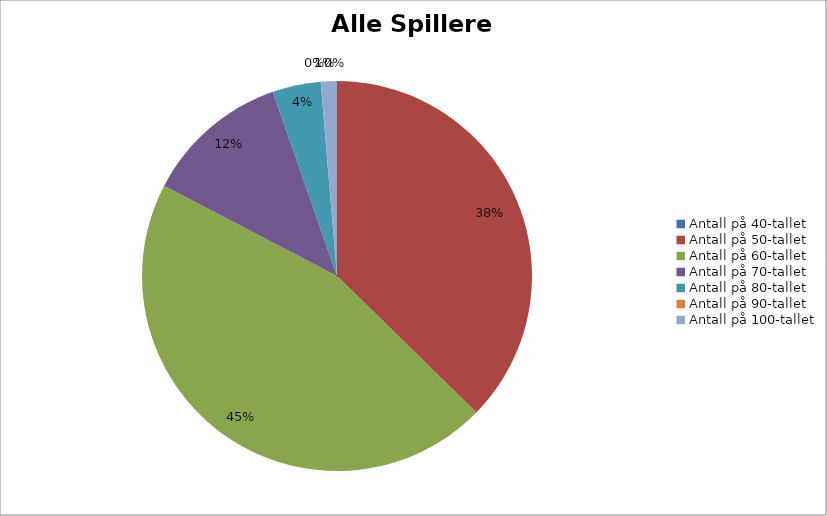
| Category | Alle Spillere totalt |
|---|---|
| Antall på 40-tallet | 0 |
| Antall på 50-tallet | 28 |
| Antall på 60-tallet | 34 |
| Antall på 70-tallet | 9 |
| Antall på 80-tallet | 3 |
| Antall på 90-tallet | 0 |
| Antall på 100-tallet | 1 |